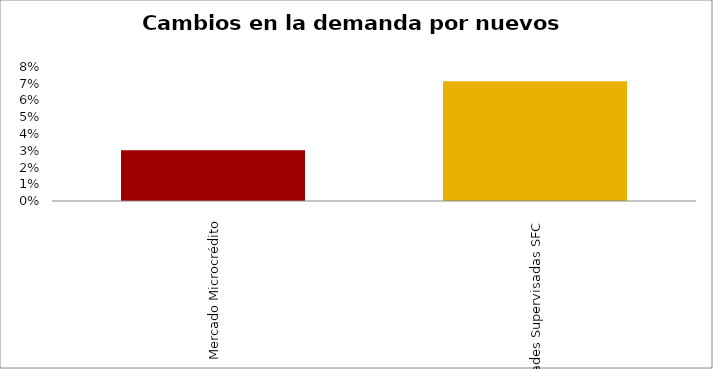
| Category | Microcrédito |
|---|---|
| Mercado Microcrédito | 0.03 |
| Entidades Supervisadas SFC | 0.071 |